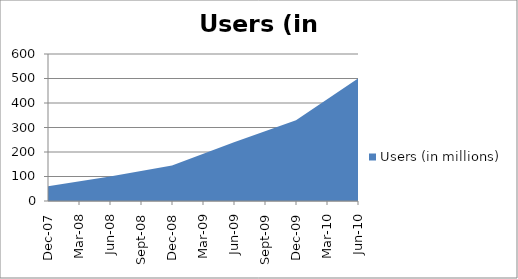
| Category | Users (in millions) |
|---|---|
| 2007-12-01 | 60 |
| 2008-06-01 | 100 |
| 2008-12-01 | 145 |
| 2009-06-01 | 240 |
| 2009-12-01 | 330 |
| 2010-06-01 | 500 |